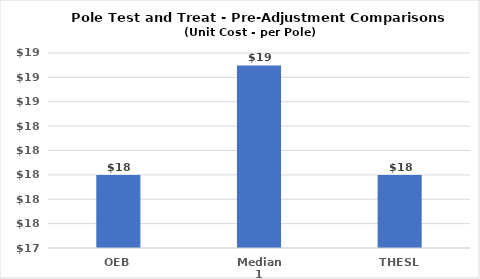
| Category | Series 0 |
|---|---|
| OEB | 18 |
| Median 1 | 18.898 |
| THESL | 18 |